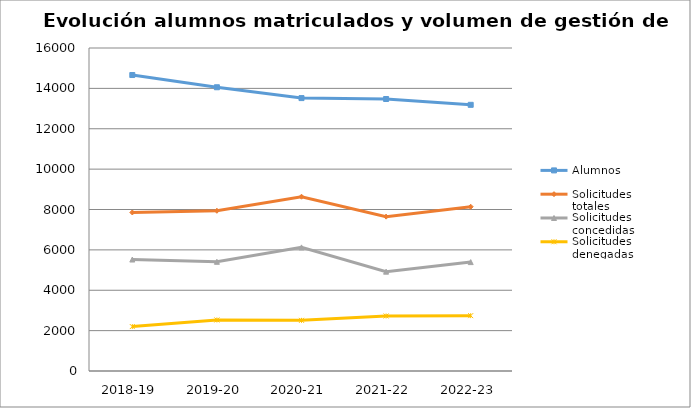
| Category | Alumnos | Solicitudes totales | Solicitudes concedidas | Solicitudes denegadas |
|---|---|---|---|---|
| 2018-19 | 14661 | 7853 | 5521 | 2201 |
| 2019-20 | 14055 | 7937 | 5409 | 2528 |
| 2020-21 | 13518 | 8632 | 6123 | 2509 |
| 2021-22 | 13473 | 7647 | 4921 | 2726 |
| 2022-23 | 13185 | 8136 | 5394 | 2742 |